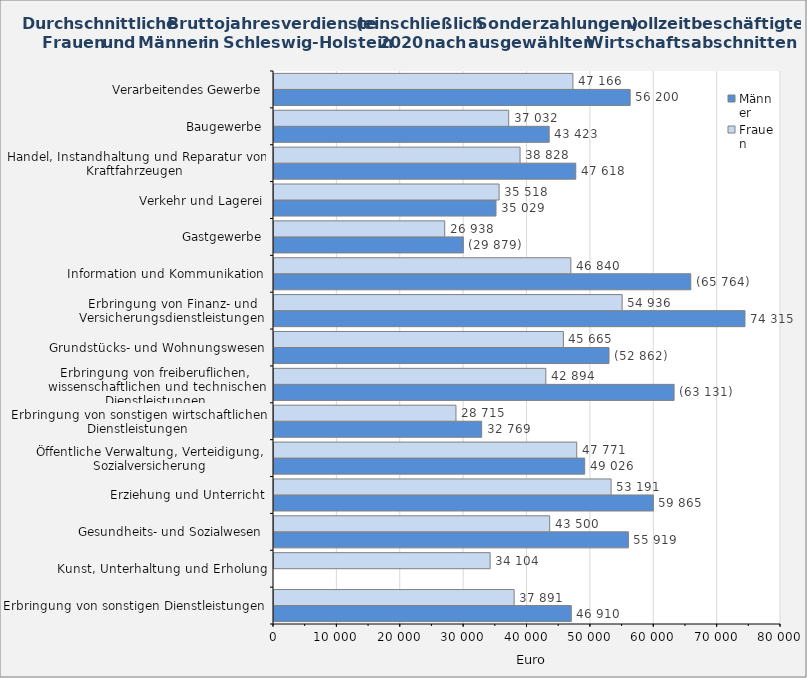
| Category | Männer | Frauen |
|---|---|---|
| Erbringung von sonstigen Dienstleistungen | 46910 | 37891 |
| Kunst, Unterhaltung und Erholung | 0 | 34104 |
| Gesundheits- und Sozialwesen | 55919 | 43500 |
| Erziehung und Unterricht | 59865 | 53191 |
| Öffentliche Verwaltung, Verteidigung, Sozialversicherung | 49026 | 47771 |
| Erbringung von sonstigen wirtschaftlichen Dienstleistungen | 32769 | 28715 |
| Erbringung von freiberuflichen, 
wissenschaftlichen und technischen Dienstleistungen | 63131 | 42894 |
| Grundstücks- und Wohnungswesen | 52862 | 45665 |
| Erbringung von Finanz- und Versicherungsdienstleistungen | 74315 | 54936 |
| Information und Kommunikation | 65764 | 46840 |
| Gastgewerbe | 29879 | 26938 |
| Verkehr und Lagerei | 35029 | 35518 |
| Handel, Instandhaltung und Reparatur von Kraftfahrzeugen | 47618 | 38828 |
| Baugewerbe | 43423 | 37032 |
| Verarbeitendes Gewerbe | 56200 | 47166 |